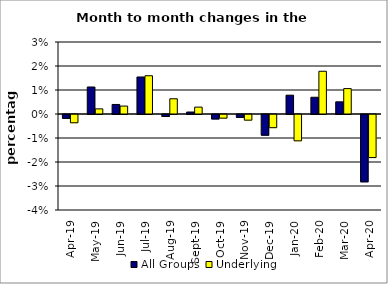
| Category | All Groups | Underlying |
|---|---|---|
| 2019-04-01 | -0.002 | -0.003 |
| 2019-05-01 | 0.011 | 0.002 |
| 2019-06-01 | 0.004 | 0.003 |
| 2019-07-01 | 0.015 | 0.016 |
| 2019-08-01 | -0.001 | 0.006 |
| 2019-09-01 | 0.001 | 0.003 |
| 2019-10-01 | -0.002 | -0.002 |
| 2019-11-01 | -0.001 | -0.002 |
| 2019-12-01 | -0.009 | -0.005 |
| 2020-01-01 | 0.008 | -0.011 |
| 2020-02-01 | 0.007 | 0.018 |
| 2020-03-01 | 0.005 | 0.011 |
| 2020-04-01 | -0.028 | -0.018 |